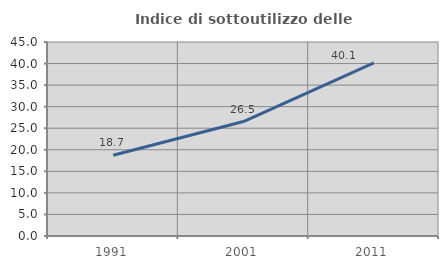
| Category | Indice di sottoutilizzo delle abitazioni  |
|---|---|
| 1991.0 | 18.733 |
| 2001.0 | 26.549 |
| 2011.0 | 40.142 |